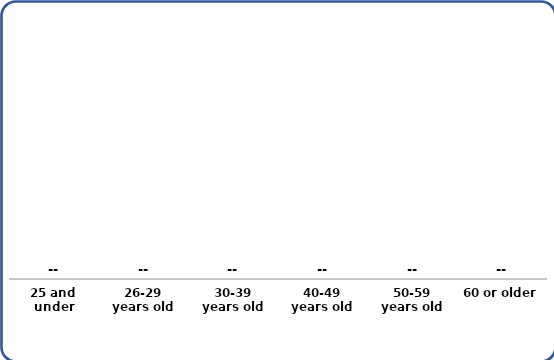
| Category | Series 0 |
|---|---|
| 25 and under | 0 |
| 26-29
years old | 0 |
| 30-39
years old | 0 |
| 40-49
years old | 0 |
| 50-59
years old | 0 |
| 60 or older | 0 |